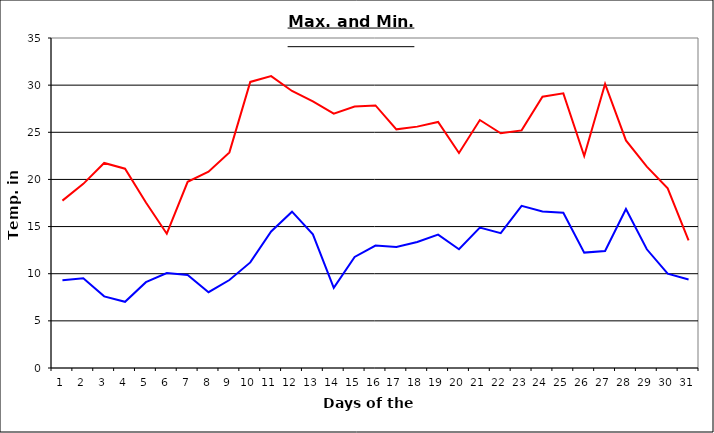
| Category | Series 0 | Series 1 |
|---|---|---|
| 0 | 17.75 | 9.31 |
| 1 | 19.53 | 9.52 |
| 2 | 21.75 | 7.6 |
| 3 | 21.14 | 7.02 |
| 4 | 17.56 | 9.1 |
| 5 | 14.24 | 10.07 |
| 6 | 19.75 | 9.86 |
| 7 | 20.82 | 8.04 |
| 8 | 22.87 | 9.33 |
| 9 | 30.34 | 11.2 |
| 10 | 30.96 | 14.48 |
| 11 | 29.38 | 16.58 |
| 12 | 28.27 | 14.17 |
| 13 | 26.98 | 8.5 |
| 14 | 27.74 | 11.78 |
| 15 | 27.85 | 12.98 |
| 16 | 25.31 | 12.83 |
| 17 | 25.6 | 13.36 |
| 18 | 26.1 | 14.14 |
| 19 | 22.8 | 12.6 |
| 20 | 26.3 | 14.9 |
| 21 | 24.9 | 14.3 |
| 22 | 25.2 | 17.2 |
| 23 | 28.78 | 16.6 |
| 24 | 29.13 | 16.47 |
| 25 | 22.49 | 12.24 |
| 26 | 30.12 | 12.41 |
| 27 | 24.14 | 16.86 |
| 28 | 21.36 | 12.591 |
| 29 | 19.05 | 10 |
| 30 | 13.54 | 9.39 |